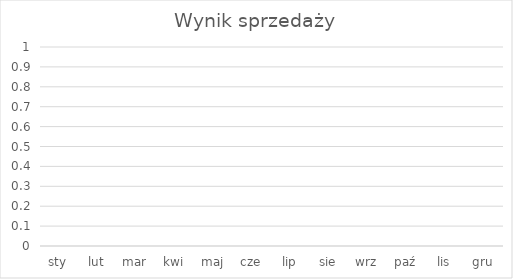
| Category | Wynik sprzedaży |
|---|---|
| sty | 112 |
| lut | 108 |
| mar | 96 |
| kwi | 100 |
| maj | 112 |
| cze | 130 |
| lip | 140 |
| sie | 84.528 |
| wrz | 85.208 |
| paź | 70.215 |
| lis | 98.586 |
| gru | 29.788 |